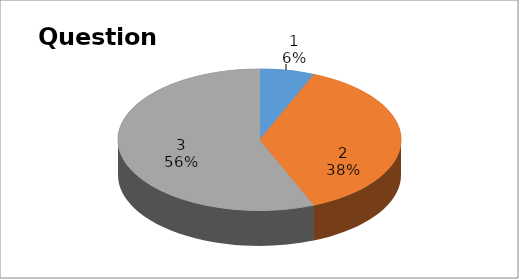
| Category | Series 0 |
|---|---|
| 0 | 2 |
| 1 | 12 |
| 2 | 18 |